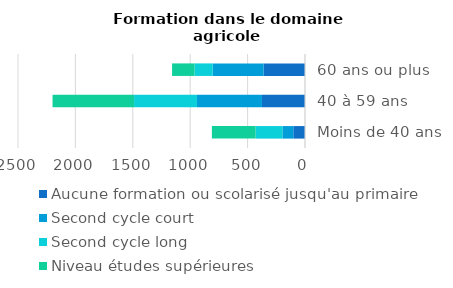
| Category | Aucune formation ou scolarisé jusqu'au primaire | Second cycle court | Second cycle long | Niveau études supérieures |
|---|---|---|---|---|
| Moins de 40 ans | 102 | 95 | 233 | 381 |
| 40 à 59 ans | 375 | 566 | 548 | 710 |
| 60 ans ou plus | 361 | 443 | 158 | 196 |